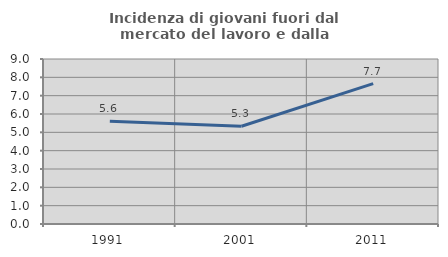
| Category | Incidenza di giovani fuori dal mercato del lavoro e dalla formazione  |
|---|---|
| 1991.0 | 5.601 |
| 2001.0 | 5.33 |
| 2011.0 | 7.653 |